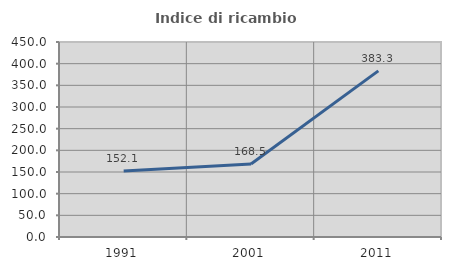
| Category | Indice di ricambio occupazionale  |
|---|---|
| 1991.0 | 152.137 |
| 2001.0 | 168.478 |
| 2011.0 | 383.333 |